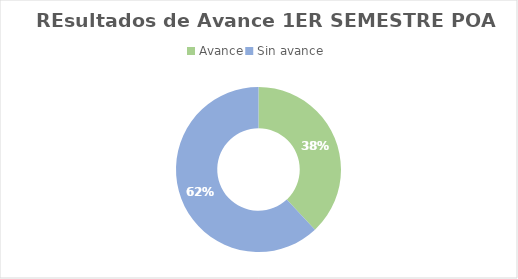
| Category | Series 0 |
|---|---|
| Avance | 0.38 |
| Sin avance  | 0.62 |